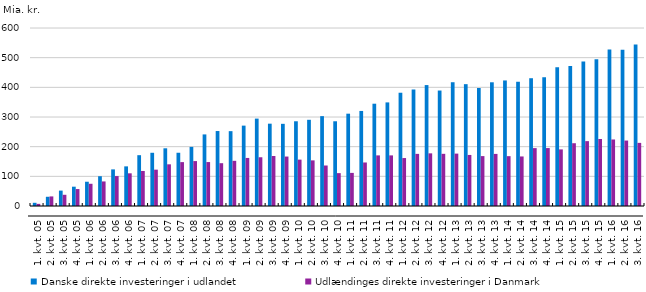
| Category | Danske direkte investeringer i udlandet | Udlændinges direkte investeringer i Danmark |
|---|---|---|
| 1. kvt. 05 | 10.8 | 7.2 |
| 2. kvt. 05 | 31.1 | 32.3 |
| 3. kvt. 05 | 51.9 | 37.8 |
| 4. kvt. 05 | 65.1 | 57.1 |
| 1. kvt. 06 | 81.8 | 74.9 |
| 2. kvt. 06 | 100.4 | 82.8 |
| 3. kvt. 06 | 123.4 | 100.9 |
| 4. kvt. 06 | 133.6 | 110.2 |
| 1. kvt. 07 | 171.3 | 118.1 |
| 2. kvt. 07 | 179.4 | 122.5 |
| 3. kvt. 07 | 194.5 | 140.5 |
| 4. kvt. 07 | 179.5 | 147.9 |
| 1. kvt. 08 | 199.3 | 151.4 |
| 2. kvt. 08 | 241.3 | 148.1 |
| 3. kvt. 08 | 252.7 | 144.3 |
| 4. kvt. 08 | 252.3 | 152.3 |
| 1. kvt. 09 | 270.9 | 162 |
| 2. kvt. 09 | 294.6 | 164.3 |
| 3. kvt. 09 | 277.5 | 168.6 |
| 4. kvt. 09 | 277 | 166.7 |
| 1. kvt. 10 | 285.6 | 156.3 |
| 2. kvt. 10 | 290.6 | 153.8 |
| 3. kvt. 10 | 302.9 | 136.5 |
| 4. kvt. 10 | 285.6 | 110.8 |
| 1. kvt. 11 | 311.2 | 111.6 |
| 2. kvt. 11 | 320.4 | 146.7 |
| 3. kvt. 11 | 344.8 | 170.6 |
| 4. kvt. 11 | 349.2 | 170.6 |
| 1. kvt. 12 | 381.8 | 161.6 |
| 2. kvt. 12 | 392.7 | 175.7 |
| 3. kvt. 12 | 407.6 | 177.5 |
| 4. kvt. 12 | 389.2 | 175.9 |
| 1. kvt. 13 | 417.2 | 176.6 |
| 2. kvt. 13 | 410.7 | 172.1 |
| 3. kvt. 13 | 397.7 | 168.2 |
| 4. kvt. 13 | 417 | 175.6 |
| 1. kvt. 14 | 423.2 | 168 |
| 2. kvt. 14 | 418.8 | 167 |
| 3. kvt. 14 | 430.7 | 195.1 |
| 4. kvt. 14 | 433.8 | 195.3 |
| 1. kvt. 15 | 467.9 | 190.8 |
| 2. kvt. 15 | 471.5 | 211.6 |
| 3. kvt. 15 | 486.8 | 218.6 |
| 4. kvt. 15 | 494.8 | 225.9 |
| 1. kvt. 16 | 527.6 | 224.2 |
| 2. kvt. 16 | 526.9 | 220.6 |
| 3. kvt. 16 | 544.2 | 212.8 |